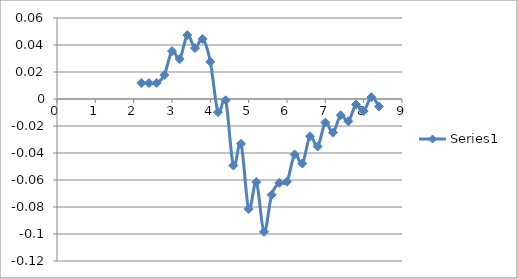
| Category | Series 0 |
|---|---|
| 2.2 | 0.012 |
| 2.4 | 0.012 |
| 2.6 | 0.012 |
| 2.8 | 0.018 |
| 3.0 | 0.035 |
| 3.2 | 0.03 |
| 3.4 | 0.047 |
| 3.6 | 0.038 |
| 3.8 | 0.044 |
| 4.0 | 0.028 |
| 4.2 | -0.01 |
| 4.4 | -0.001 |
| 4.6 | -0.049 |
| 4.8 | -0.033 |
| 5.0 | -0.081 |
| 5.2 | -0.062 |
| 5.4 | -0.098 |
| 5.6 | -0.071 |
| 5.8 | -0.062 |
| 5.99999999999999 | -0.061 |
| 6.19999999999999 | -0.041 |
| 6.39999999999999 | -0.048 |
| 6.59999999999999 | -0.028 |
| 6.79999999999999 | -0.035 |
| 6.99999999999999 | -0.017 |
| 7.19999999999999 | -0.025 |
| 7.39999999999999 | -0.012 |
| 7.59999999999999 | -0.017 |
| 7.79999999999999 | -0.004 |
| 7.99999999999999 | -0.009 |
| 8.19999999999999 | 0.001 |
| 8.39999999999999 | -0.006 |